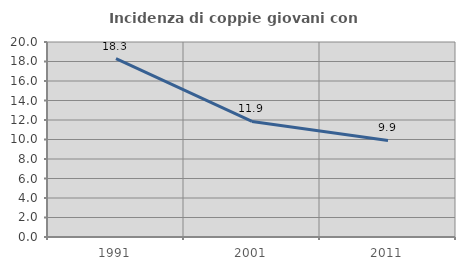
| Category | Incidenza di coppie giovani con figli |
|---|---|
| 1991.0 | 18.286 |
| 2001.0 | 11.856 |
| 2011.0 | 9.909 |